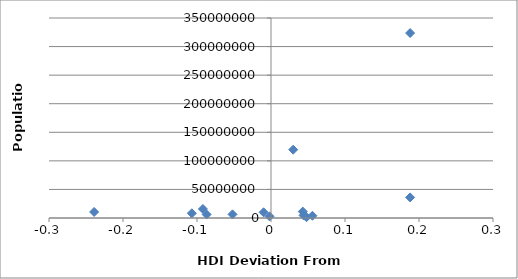
| Category | Series 0 |
|---|---|
| 0.18800000000000006 | 36048521 |
| 0.18800000000000006 | 323625762 |
| 0.030000000000000027 | 119530753 |
| 0.04300000000000004 | 11238317 |
| -0.0020000000000000018 | 2950210 |
| 0.04400000000000004 | 4586353 |
| -0.010000000000000009 | 9980243 |
| -0.051999999999999935 | 6377195 |
| -0.09199999999999997 | 15806675 |
| -0.239 | 10604000 |
| -0.10699999999999998 | 8249574 |
| -0.08699999999999997 | 6167237 |
| 0.05600000000000005 | 3929141 |
| 0.04800000000000004 | 1349667 |